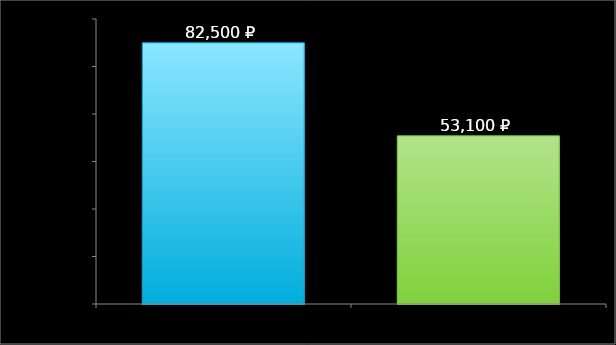
| Category | Series 0 |
|---|---|
| 0 | 82500 |
| 1 | 53100 |